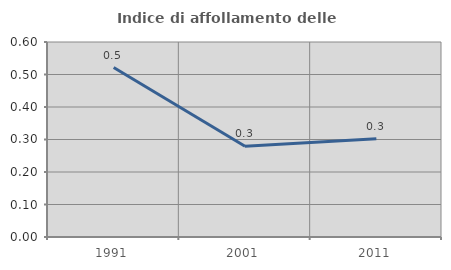
| Category | Indice di affollamento delle abitazioni  |
|---|---|
| 1991.0 | 0.521 |
| 2001.0 | 0.279 |
| 2011.0 | 0.302 |